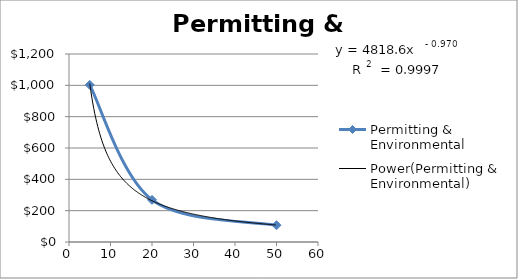
| Category | Permitting & Environmental |
|---|---|
| 5.0 | 1003 |
| 20.0 | 269 |
| 50.0 | 107 |